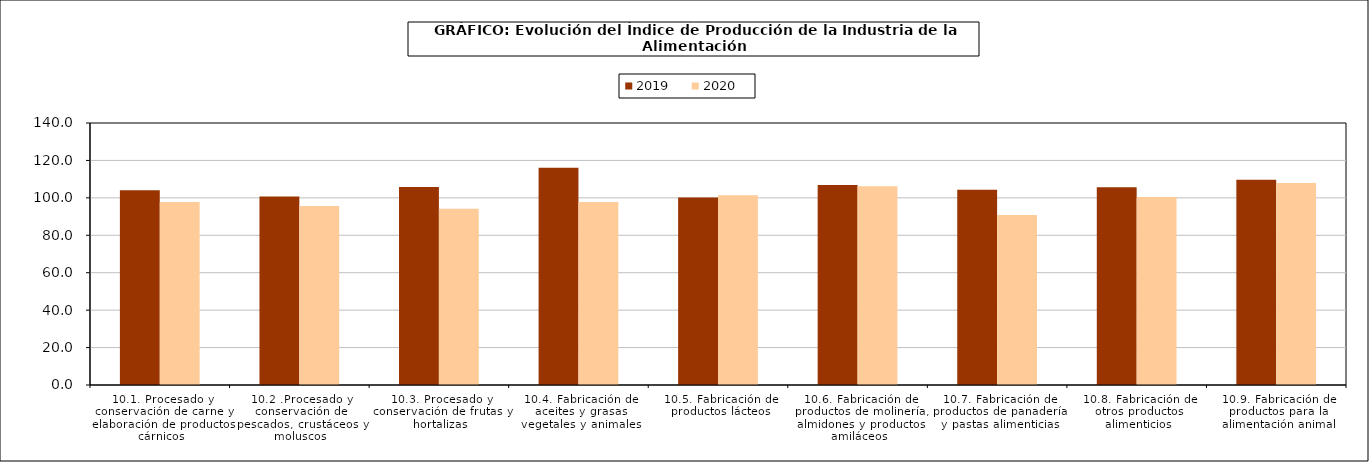
| Category | 2019 | 2020 |
|---|---|---|
| 10.1. Procesado y conservación de carne y elaboración de productos cárnicos | 104.053 | 97.752 |
| 10.2 .Procesado y conservación de pescados, crustáceos y moluscos | 100.74 | 95.608 |
| 10.3. Procesado y conservación de frutas y hortalizas | 105.838 | 94.164 |
| 10.4. Fabricación de aceites y grasas vegetales y animales | 116.13 | 97.742 |
| 10.5. Fabricación de productos lácteos | 100.142 | 101.444 |
| 10.6. Fabricación de productos de molinería, almidones y productos amiláceos | 106.845 | 106.183 |
| 10.7. Fabricación de productos de panadería y pastas alimenticias | 104.314 | 90.851 |
| 10.8. Fabricación de otros productos alimenticios | 105.654 | 100.478 |
| 10.9. Fabricación de productos para la alimentación animal | 109.61 | 107.962 |